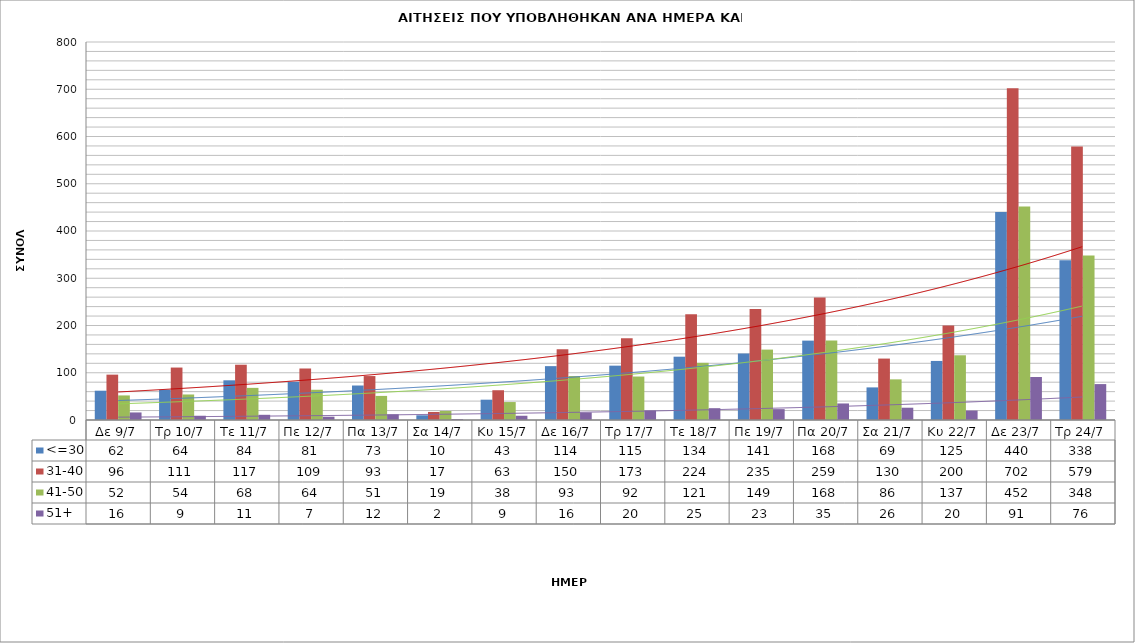
| Category | <=30 | 31-40 | 41-50 | 51+ |
|---|---|---|---|---|
| Δε 9/7 | 62 | 96 | 52 | 16 |
| Τρ 10/7 | 64 | 111 | 54 | 9 |
| Τε 11/7 | 84 | 117 | 68 | 11 |
| Πε 12/7 | 81 | 109 | 64 | 7 |
| Πα 13/7 | 73 | 93 | 51 | 12 |
| Σα 14/7 | 10 | 17 | 19 | 2 |
| Κυ 15/7 | 43 | 63 | 38 | 9 |
| Δε 16/7 | 114 | 150 | 93 | 16 |
| Τρ 17/7 | 115 | 173 | 92 | 20 |
| Τε 18/7 | 134 | 224 | 121 | 25 |
| Πε 19/7 | 141 | 235 | 149 | 23 |
| Πα 20/7 | 168 | 259 | 168 | 35 |
| Σα 21/7 | 69 | 130 | 86 | 26 |
| Κυ 22/7 | 125 | 200 | 137 | 20 |
| Δε 23/7 | 440 | 702 | 452 | 91 |
| Τρ 24/7 | 338 | 579 | 348 | 76 |